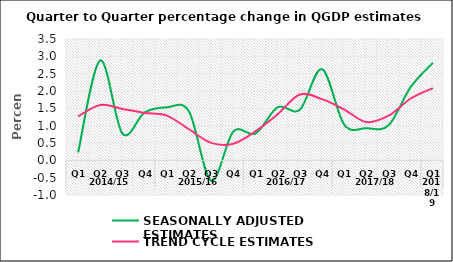
| Category | SEASONALLY ADJUSTED ESTIMATES | TREND CYCLE ESTIMATES |
|---|---|---|
| 0 | 0.226 | 1.269 |
| 1 | 2.882 | 1.598 |
| 2 | 0.771 | 1.483 |
| 3 | 1.38 | 1.368 |
| 4 | 1.528 | 1.291 |
| 5 | 1.409 | 0.896 |
| 6 | -0.586 | 0.505 |
| 7 | 0.83 | 0.48 |
| 8 | 0.773 | 0.838 |
| 9 | 1.532 | 1.33 |
| 10 | 1.461 | 1.898 |
| 11 | 2.628 | 1.765 |
| 12 | 1.031 | 1.465 |
| 13 | 0.928 | 1.104 |
| 14 | 1.011 | 1.287 |
| 15 | 2.117 | 1.783 |
| 16 | 2.814 | 2.084 |